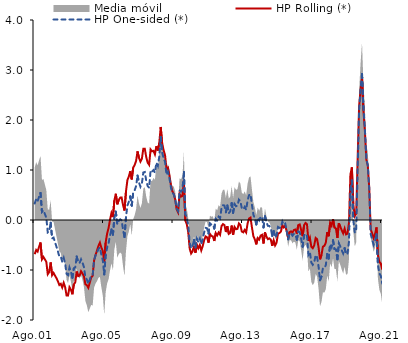
| Category | HP Rolling (*) | HP One-sided (*) |
|---|---|---|
| Ago.01 | -0.684 | 0.331 |
| Sep.01 | -0.598 | 0.42 |
| Oct.01 | -0.632 | 0.375 |
| Nov.01 | -0.536 | 0.464 |
| Dic.01 | -0.45 | 0.541 |
| Ene.02 | -0.787 | 0.163 |
| Feb.02 | -0.738 | 0.195 |
| Mar.02 | -0.787 | 0.12 |
| Abr.02 | -0.837 | 0.046 |
| May.02 | -1.083 | -0.248 |
| Jun.02 | -1.039 | -0.227 |
| Jul.02 | -0.849 | -0.054 |
| Ago.02 | -1.104 | -0.368 |
| Sep.02 | -1.059 | -0.352 |
| Oct.02 | -1.111 | -0.443 |
| Nov.02 | -1.164 | -0.534 |
| Dic.02 | -1.224 | -0.627 |
| Ene.03 | -1.3 | -0.732 |
| Feb.03 | -1.276 | -0.731 |
| Mar.03 | -1.35 | -0.836 |
| Abr.03 | -1.256 | -0.758 |
| May.03 | -1.344 | -0.873 |
| Jun.03 | -1.512 | -1.075 |
| Jul.03 | -1.512 | -1.102 |
| Ago.03 | -1.344 | -0.95 |
| Sep.03 | -1.393 | -1.03 |
| Oct.03 | -1.485 | -1.157 |
| Nov.03 | -1.291 | -0.97 |
| Dic.03 | -1.245 | -0.944 |
| Ene.04 | -1.029 | -0.729 |
| Feb.04 | -1.122 | -0.849 |
| Mar.04 | -1.112 | -0.859 |
| Abr.04 | -1.024 | -0.787 |
| May.04 | -1.068 | -0.852 |
| Jun.04 | -1.128 | -0.943 |
| Jul.04 | -1.284 | -1.143 |
| Ago.04 | -1.303 | -1.19 |
| Sep.04 | -1.356 | -1.276 |
| Oct.04 | -1.253 | -1.195 |
| Nov.04 | -1.151 | -1.113 |
| Dic.04 | -1.115 | -1.103 |
| Ene.05 | -0.812 | -0.798 |
| Feb.05 | -0.697 | -0.71 |
| Mar.05 | -0.61 | -0.653 |
| Abr.05 | -0.516 | -0.583 |
| May.05 | -0.453 | -0.548 |
| Jun.05 | -0.552 | -0.693 |
| Jul.05 | -0.617 | -0.806 |
| Ago.05 | -0.836 | -1.087 |
| Sep.05 | -0.448 | -0.705 |
| Oct.05 | -0.272 | -0.549 |
| Nov.05 | -0.16 | -0.463 |
| Dic.05 | 0.007 | -0.311 |
| Ene.06 | 0.139 | -0.189 |
| Feb.06 | 0.058 | -0.297 |
| Mar.06 | 0.391 | 0.042 |
| Abr.06 | 0.525 | 0.169 |
| May.06 | 0.314 | -0.083 |
| Jun.06 | 0.395 | -0.019 |
| Jul.06 | 0.447 | 0.014 |
| Ago.06 | 0.451 | -0.006 |
| Sep.06 | 0.297 | -0.198 |
| Oct.06 | 0.189 | -0.343 |
| Nov.06 | 0.567 | 0.05 |
| Dic.06 | 0.797 | 0.292 |
| Ene.07 | 0.872 | 0.364 |
| Feb.07 | 0.976 | 0.472 |
| Mar.07 | 0.812 | 0.288 |
| Abr.07 | 1.049 | 0.539 |
| May.07 | 1.099 | 0.593 |
| Jun.07 | 1.182 | 0.679 |
| Jul.07 | 1.372 | 0.889 |
| Ago.07 | 1.242 | 0.748 |
| Sep.07 | 1.167 | 0.665 |
| Oct.07 | 1.228 | 0.73 |
| Nov.07 | 1.425 | 0.95 |
| Dic.07 | 1.426 | 0.96 |
| Ene.08 | 1.26 | 0.789 |
| Feb.08 | 1.146 | 0.678 |
| Mar.08 | 1.104 | 0.646 |
| Abr.08 | 1.411 | 0.993 |
| May.08 | 1.374 | 0.97 |
| Jun.08 | 1.383 | 0.999 |
| Jul.08 | 1.313 | 0.947 |
| Ago.08 | 1.476 | 1.148 |
| Sep.08 | 1.39 | 1.081 |
| Oct.08 | 1.536 | 1.268 |
| Nov.08 | 1.861 | 1.661 |
| Dic.08 | 1.536 | 1.348 |
| Ene.09 | 1.396 | 1.234 |
| Feb.09 | 1.297 | 1.163 |
| Mar.09 | 1.023 | 0.902 |
| Abr.09 | 1.047 | 0.962 |
| May.09 | 0.9 | 0.839 |
| Jun.09 | 0.707 | 0.661 |
| Jul.09 | 0.577 | 0.547 |
| Ago.09 | 0.522 | 0.515 |
| Sep.09 | 0.411 | 0.42 |
| Oct.09 | 0.213 | 0.227 |
| Nov.09 | 0.152 | 0.178 |
| Dic.09 | 0.517 | 0.595 |
| Ene.10 | 0.468 | 0.566 |
| Feb.10 | 0.482 | 0.603 |
| Mar.10 | 0.788 | 0.961 |
| Abr.10 | -0.011 | 0.113 |
| May.10 | -0.082 | 0.05 |
| Jun.10 | -0.242 | -0.11 |
| Jul.10 | -0.571 | -0.459 |
| Ago.10 | -0.671 | -0.568 |
| Sep.10 | -0.627 | -0.519 |
| Oct.10 | -0.516 | -0.397 |
| Nov.10 | -0.654 | -0.549 |
| Dic.10 | -0.494 | -0.374 |
| Ene.11 | -0.565 | -0.446 |
| Feb.11 | -0.499 | -0.369 |
| Mar.11 | -0.608 | -0.485 |
| Abr.11 | -0.521 | -0.387 |
| May.11 | -0.403 | -0.248 |
| Jun.11 | -0.329 | -0.156 |
| Jul.11 | -0.347 | -0.167 |
| Ago.11 | -0.454 | -0.271 |
| Sep.11 | -0.279 | -0.068 |
| Oct.11 | -0.318 | -0.094 |
| Nov.11 | -0.329 | -0.09 |
| Dic.11 | -0.42 | -0.171 |
| Ene.12 | -0.261 | 0.022 |
| Feb.12 | -0.308 | -0.014 |
| Mar.12 | -0.251 | 0.065 |
| Abr.12 | -0.295 | 0.034 |
| May.12 | -0.121 | 0.239 |
| Jun.12 | -0.083 | 0.295 |
| Jul.12 | -0.101 | 0.29 |
| Ago.12 | -0.24 | 0.155 |
| Sep.12 | -0.125 | 0.292 |
| Oct.12 | -0.277 | 0.138 |
| Nov.12 | -0.258 | 0.168 |
| Dic.12 | -0.111 | 0.337 |
| Ene.13 | -0.294 | 0.145 |
| Feb.13 | -0.14 | 0.317 |
| Mar.13 | -0.185 | 0.274 |
| Abr.13 | -0.176 | 0.287 |
| May.13 | -0.069 | 0.408 |
| Jun.13 | -0.1 | 0.377 |
| Jul.13 | -0.231 | 0.233 |
| Ago.13 | -0.247 | 0.212 |
| Sep.13 | -0.198 | 0.262 |
| Oct.13 | -0.248 | 0.203 |
| Nov.13 | -0.067 | 0.393 |
| Dic.13 | 0.029 | 0.497 |
| Ene.14 | 0.047 | 0.515 |
| Feb.14 | -0.148 | 0.303 |
| Mar.14 | -0.323 | 0.108 |
| Abr.14 | -0.389 | 0.027 |
| May.14 | -0.488 | -0.089 |
| Jun.14 | -0.36 | 0.039 |
| Jul.14 | -0.391 | -0.007 |
| Ago.14 | -0.312 | 0.063 |
| Sep.14 | -0.296 | 0.063 |
| Oct.14 | -0.47 | -0.148 |
| Nov.14 | -0.248 | 0.072 |
| Dic.14 | -0.334 | -0.041 |
| Ene.15 | -0.383 | -0.117 |
| Feb.15 | -0.368 | -0.118 |
| Mar.15 | -0.393 | -0.164 |
| Abr.15 | -0.517 | -0.318 |
| May.15 | -0.407 | -0.218 |
| Jun.15 | -0.509 | -0.349 |
| Jul.15 | -0.453 | -0.311 |
| Ago.15 | -0.272 | -0.139 |
| Sep.15 | -0.262 | -0.156 |
| Oct.15 | -0.232 | -0.147 |
| Nov.15 | -0.107 | -0.033 |
| Dic.15 | -0.148 | -0.097 |
| Ene.16 | -0.111 | -0.074 |
| Feb.16 | -0.226 | -0.217 |
| Mar.16 | -0.361 | -0.385 |
| Abr.16 | -0.242 | -0.272 |
| May.16 | -0.227 | -0.271 |
| Jun.16 | -0.248 | -0.313 |
| Jul.16 | -0.2 | -0.278 |
| Ago.16 | -0.19 | -0.286 |
| Sep.16 | -0.271 | -0.393 |
| Oct.16 | -0.102 | -0.231 |
| Nov.16 | -0.089 | -0.241 |
| Dic.16 | -0.198 | -0.38 |
| Ene.17 | -0.324 | -0.534 |
| Feb.17 | -0.105 | -0.311 |
| Mar.17 | -0.059 | -0.273 |
| Abr.17 | -0.084 | -0.316 |
| May.17 | -0.417 | -0.692 |
| Jun.17 | -0.352 | -0.637 |
| Jul.17 | -0.533 | -0.85 |
| Ago.17 | -0.563 | -0.895 |
| Sep.17 | -0.507 | -0.85 |
| Oct.17 | -0.358 | -0.703 |
| Nov.17 | -0.383 | -0.743 |
| Dic.17 | -0.545 | -0.93 |
| Ene.18 | -0.786 | -1.206 |
| Feb.18 | -0.701 | -1.13 |
| Mar.18 | -0.533 | -0.964 |
| Abr.18 | -0.516 | -0.961 |
| May.18 | -0.455 | -0.904 |
| Jun.18 | -0.241 | -0.678 |
| Jul.18 | -0.325 | -0.774 |
| Ago.18 | -0.054 | -0.484 |
| Sep.18 | -0.112 | -0.545 |
| Oct.18 | 0.014 | -0.405 |
| Nov.18 | -0.152 | -0.581 |
| Dic.18 | -0.17 | -0.588 |
| Ene.19 | -0.357 | -0.787 |
| Feb.19 | -0.067 | -0.465 |
| Mar.19 | -0.131 | -0.527 |
| Abr.19 | -0.205 | -0.605 |
| May.19 | -0.268 | -0.669 |
| Jun.19 | -0.173 | -0.563 |
| Jul.19 | -0.287 | -0.687 |
| Ago.19 | -0.272 | -0.673 |
| Sep.19 | -0.056 | -0.438 |
| Oct.19 | 0.91 | 0.621 |
| Nov.19 | 1.052 | 0.791 |
| Dic.19 | 0.312 | -0.006 |
| Ene.20 | 0.076 | -0.253 |
| Feb.20 | 0.128 | -0.19 |
| Mar.20 | 1.235 | 1.033 |
| Abr.20 | 2.274 | 2.205 |
| May.20 | 2.609 | 2.611 |
| Jun.20 | 2.849 | 2.919 |
| Jul.20 | 2.189 | 2.24 |
| Ago.20 | 1.785 | 1.828 |
| Sep.20 | 1.207 | 1.217 |
| Oct.20 | 1.09 | 1.101 |
| Nov.20 | 0.646 | 0.627 |
| Dic.20 | -0.189 | -0.285 |
| Ene.21 | -0.267 | -0.379 |
| Feb.21 | -0.363 | -0.495 |
| Mar.21 | -0.283 | -0.419 |
| Abr.21 | -0.148 | -0.284 |
| May.21 | -0.704 | -0.903 |
| Jun.21 | -0.837 | -1.065 |
| Jul.21 | -0.871 | -1.12 |
| Ago.21 | -0.993 | -1.273 |